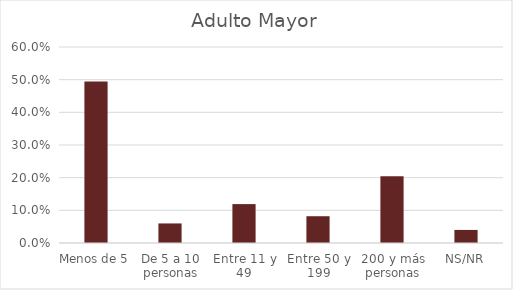
| Category | Adulto Mayor |
|---|---|
| Menos de 5 | 0.495 |
| De 5 a 10 personas | 0.06 |
| Entre 11 y 49 | 0.119 |
| Entre 50 y 199 | 0.082 |
| 200 y más personas | 0.204 |
| NS/NR | 0.04 |